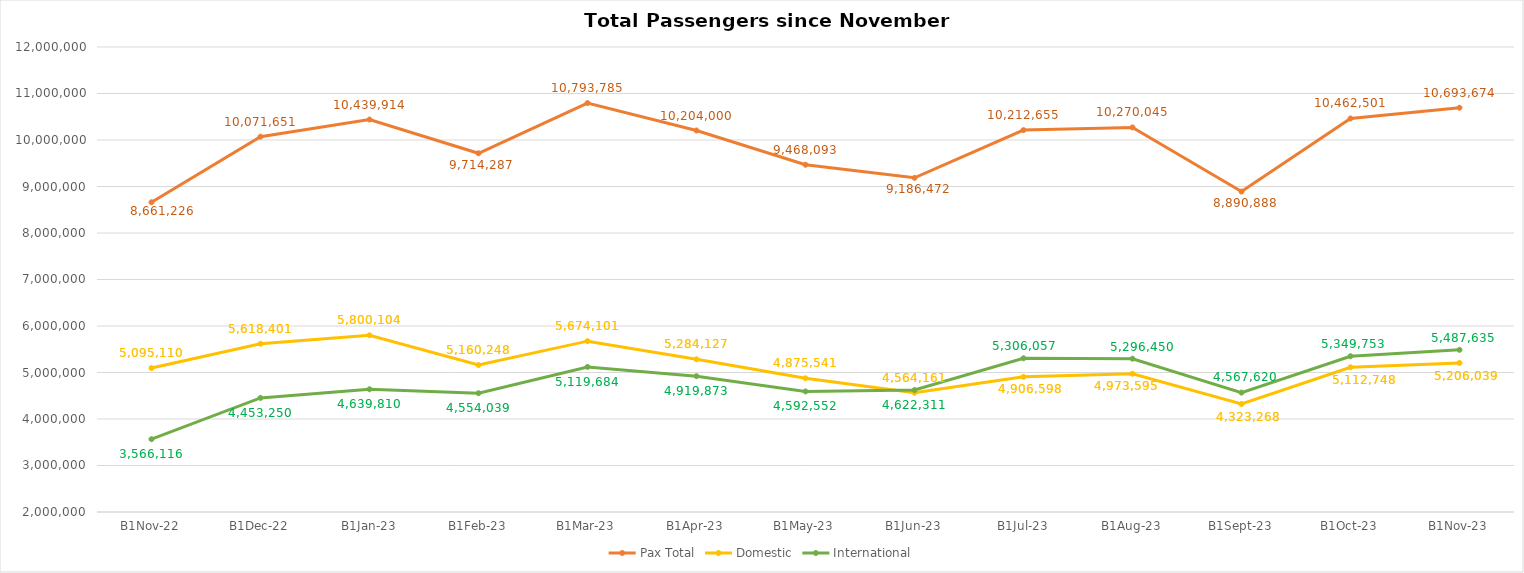
| Category | Pax Total | Domestic | International |
|---|---|---|---|
| 2022-11-01 | 8661226 | 5095110 | 3566116 |
| 2022-12-01 | 10071651 | 5618401 | 4453250 |
| 2023-01-01 | 10439914 | 5800104 | 4639810 |
| 2023-02-01 | 9714287 | 5160248 | 4554039 |
| 2023-03-01 | 10793785 | 5674101 | 5119684 |
| 2023-04-01 | 10204000 | 5284127 | 4919873 |
| 2023-05-01 | 9468093 | 4875541 | 4592552 |
| 2023-06-01 | 9186472 | 4564161 | 4622311 |
| 2023-07-01 | 10212655 | 4906598 | 5306057 |
| 2023-08-01 | 10270045 | 4973595 | 5296450 |
| 2023-09-01 | 8890888 | 4323268 | 4567620 |
| 2023-10-01 | 10462501 | 5112748 | 5349753 |
| 2023-11-01 | 10693674 | 5206039 | 5487635 |